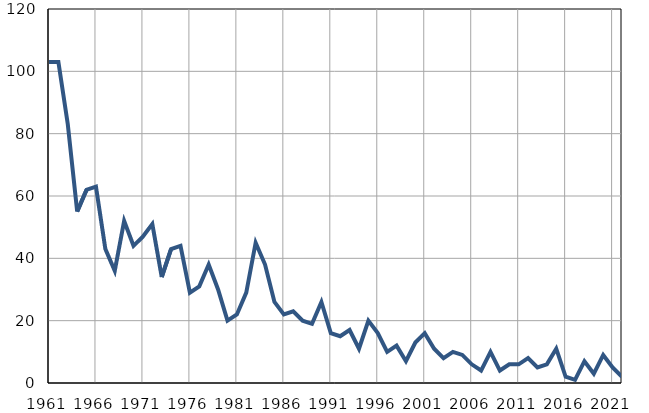
| Category | Умрла 
одојчад |
|---|---|
| 1961.0 | 103 |
| 1962.0 | 103 |
| 1963.0 | 83 |
| 1964.0 | 55 |
| 1965.0 | 62 |
| 1966.0 | 63 |
| 1967.0 | 43 |
| 1968.0 | 36 |
| 1969.0 | 52 |
| 1970.0 | 44 |
| 1971.0 | 47 |
| 1972.0 | 51 |
| 1973.0 | 34 |
| 1974.0 | 43 |
| 1975.0 | 44 |
| 1976.0 | 29 |
| 1977.0 | 31 |
| 1978.0 | 38 |
| 1979.0 | 30 |
| 1980.0 | 20 |
| 1981.0 | 22 |
| 1982.0 | 29 |
| 1983.0 | 45 |
| 1984.0 | 38 |
| 1985.0 | 26 |
| 1986.0 | 22 |
| 1987.0 | 23 |
| 1988.0 | 20 |
| 1989.0 | 19 |
| 1990.0 | 26 |
| 1991.0 | 16 |
| 1992.0 | 15 |
| 1993.0 | 17 |
| 1994.0 | 11 |
| 1995.0 | 20 |
| 1996.0 | 16 |
| 1997.0 | 10 |
| 1998.0 | 12 |
| 1999.0 | 7 |
| 2000.0 | 13 |
| 2001.0 | 16 |
| 2002.0 | 11 |
| 2003.0 | 8 |
| 2004.0 | 10 |
| 2005.0 | 9 |
| 2006.0 | 6 |
| 2007.0 | 4 |
| 2008.0 | 10 |
| 2009.0 | 4 |
| 2010.0 | 6 |
| 2011.0 | 6 |
| 2012.0 | 8 |
| 2013.0 | 5 |
| 2014.0 | 6 |
| 2015.0 | 11 |
| 2016.0 | 2 |
| 2017.0 | 1 |
| 2018.0 | 7 |
| 2019.0 | 3 |
| 2020.0 | 9 |
| 2021.0 | 5 |
| 2022.0 | 2 |